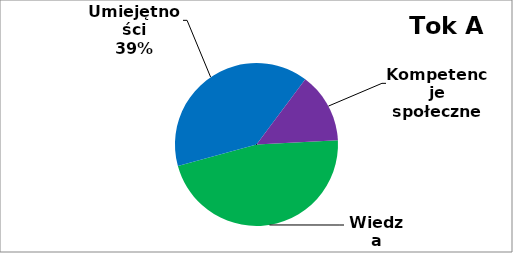
| Category | Series 0 |
|---|---|
| 0 | 157 |
| 1 | 133 |
| 2 | 47 |